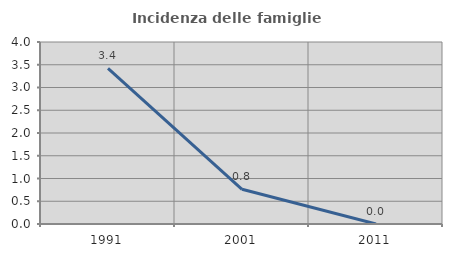
| Category | Incidenza delle famiglie numerose |
|---|---|
| 1991.0 | 3.419 |
| 2001.0 | 0.763 |
| 2011.0 | 0 |